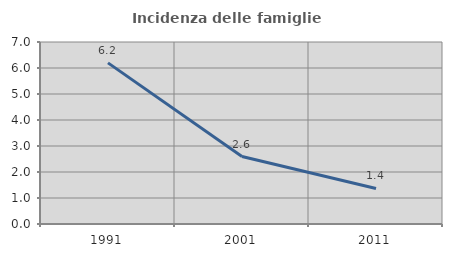
| Category | Incidenza delle famiglie numerose |
|---|---|
| 1991.0 | 6.198 |
| 2001.0 | 2.594 |
| 2011.0 | 1.366 |